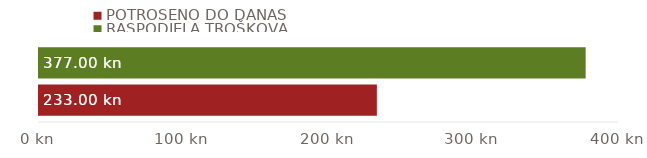
| Category | POTROŠENO DO DANAS | RASPODJELA TROŠKOVA |
|---|---|---|
| UKUPNI IZNOSI | 233 | 377 |